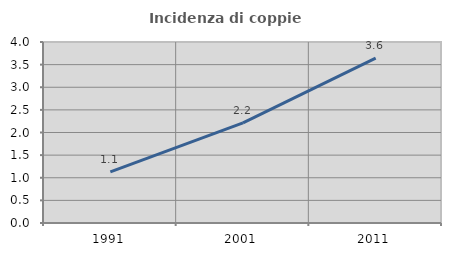
| Category | Incidenza di coppie miste |
|---|---|
| 1991.0 | 1.13 |
| 2001.0 | 2.211 |
| 2011.0 | 3.645 |